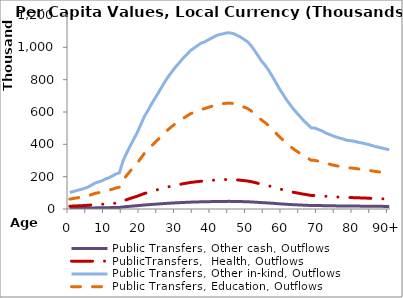
| Category | Public Transfers, Other cash, Outflows | PublicTransfers,  Health, Outflows | Public Transfers, Other in-kind, Outflows | Public Transfers, Education, Outflows |
|---|---|---|---|---|
| 0 | 4410.069 | 17063.185 | 101889.448 | 61240.332 |
|  | 4679.16 | 18104.336 | 108106.475 | 64977.057 |
| 2 | 4948.251 | 19145.487 | 114323.502 | 68713.782 |
| 3 | 5217.342 | 20186.637 | 120540.529 | 72450.506 |
| 4 | 5486.433 | 21227.788 | 126757.557 | 76187.231 |
| 5 | 5808.975 | 22475.749 | 134209.511 | 80666.205 |
| 6 | 6321.265 | 24457.872 | 146045.366 | 87780.108 |
| 7 | 6901.315 | 26702.17 | 159446.747 | 95834.966 |
| 8 | 7226.914 | 27961.957 | 166969.318 | 100356.384 |
| 9 | 7522.323 | 29104.936 | 173794.392 | 104458.573 |
| 10 | 8005.09 | 30972.832 | 184948.165 | 111162.513 |
| 11 | 8348.884 | 32303.02 | 192891.123 | 115936.603 |
| 12 | 8843.313 | 34216.034 | 204314.31 | 122802.474 |
| 13 | 9373.34 | 36266.786 | 216559.968 | 130162.688 |
| 14 | 9721.82 | 37615.106 | 224611.195 | 135001.853 |
| 15 | 12869.065 | 49792.241 | 297324.562 | 178705.993 |
| 16 | 14923.259 | 57740.21 | 344784.294 | 207231.516 |
| 17 | 16827.781 | 65109.078 | 388786.035 | 233678.624 |
| 18 | 18647.33 | 72149.172 | 430824.572 | 258945.755 |
| 19 | 20450.364 | 79125.366 | 472481.538 | 283983.544 |
| 20 | 22584.677 | 87383.326 | 521792.321 | 313621.635 |
| 21 | 24752.427 | 95770.661 | 571875.637 | 343724.054 |
| 22 | 26306.238 | 101782.575 | 607774.601 | 365301.014 |
| 23 | 28080.026 | 108645.617 | 648755.902 | 389932.696 |
| 24 | 29637.474 | 114671.601 | 684738.881 | 411560.152 |
| 25 | 31181.022 | 120643.81 | 720400.748 | 432994.605 |
| 26 | 32790.407 | 126870.749 | 757583.688 | 455343.294 |
| 27 | 34377.224 | 133010.371 | 794245.232 | 477378.6 |
| 28 | 35763.812 | 138375.276 | 826280.708 | 496633.422 |
| 29 | 37070.889 | 143432.543 | 856479.18 | 514784.119 |
| 30 | 38240.795 | 147959.075 | 883508.473 | 531029.991 |
| 31 | 39314.605 | 152113.8 | 908317.596 | 545941.436 |
| 32 | 40468.771 | 156579.434 | 934983.249 | 561968.743 |
| 33 | 41412.797 | 160232.004 | 956793.851 | 575077.937 |
| 34 | 42411.259 | 164095.194 | 979862.133 | 588943.055 |
| 35 | 43076.762 | 166670.122 | 995237.804 | 598184.554 |
| 36 | 43767.657 | 169343.291 | 1011200.111 | 607778.648 |
| 37 | 44399.584 | 171788.305 | 1025800.03 | 616553.884 |
| 38 | 44736.104 | 173090.349 | 1033574.925 | 621226.96 |
| 39 | 45279.554 | 175193.035 | 1046130.701 | 628773.569 |
| 40 | 45751.83 | 177020.338 | 1057042.085 | 635331.823 |
| 41 | 46290.172 | 179103.262 | 1069479.855 | 642807.505 |
| 42 | 46677.716 | 180602.722 | 1078433.582 | 648189.115 |
| 43 | 46857.783 | 181299.427 | 1082593.822 | 650689.614 |
| 44 | 47133.876 | 182367.671 | 1088972.629 | 654523.576 |
| 45 | 47173.06 | 182519.281 | 1089877.94 | 655067.71 |
| 46 | 46993.878 | 181826.001 | 1085738.152 | 652579.504 |
| 47 | 46567.967 | 180178.088 | 1075897.966 | 646665.09 |
| 48 | 46090.468 | 178330.578 | 1064865.923 | 640034.316 |
| 49 | 45460.776 | 175894.21 | 1050317.629 | 631290.109 |
| 50 | 44829.472 | 173451.605 | 1035732.096 | 622523.521 |
| 51 | 43851.841 | 169669.013 | 1013145.091 | 608947.672 |
| 52 | 42521.805 | 164522.911 | 982416.156 | 590478.143 |
| 53 | 41101.014 | 159025.672 | 949590.476 | 570748.371 |
| 54 | 39635.663 | 153356.019 | 915735.263 | 550399.801 |
| 55 | 38544.794 | 149135.291 | 890532.015 | 535251.469 |
| 56 | 37151.231 | 143743.396 | 858335.379 | 515899.782 |
| 57 | 35620.198 | 137819.613 | 822962.676 | 494639.129 |
| 58 | 33957.193 | 131385.212 | 784540.916 | 471545.851 |
| 59 | 32297.077 | 124961.984 | 746185.873 | 448492.673 |
| 60 | 30836.196 | 119309.63 | 712433.956 | 428206.19 |
| 61 | 29309.346 | 113402.03 | 677157.886 | 407003.619 |
| 62 | 28032.336 | 108461.096 | 647654.071 | 389270.444 |
| 63 | 26761.273 | 103543.171 | 618287.652 | 371619.85 |
| 64 | 25686.994 | 99386.635 | 593467.715 | 356701.905 |
| 65 | 24624.289 | 95274.878 | 568915.167 | 341944.673 |
| 66 | 23563.854 | 91171.901 | 544415.051 | 327218.955 |
| 67 | 22687.988 | 87783.054 | 524179.218 | 315056.271 |
| 68 | 21722.373 | 84046.952 | 501869.819 | 301647.277 |
| 69 | 21664.12 | 83821.561 | 500523.944 | 300838.343 |
| 70 | 21308.467 | 82445.488 | 492306.995 | 295899.572 |
| 71 | 20950.016 | 81058.594 | 484025.426 | 290921.961 |
| 72 | 20395.429 | 78912.818 | 471212.35 | 283220.702 |
| 73 | 20022.635 | 77470.424 | 462599.376 | 278043.901 |
| 74 | 19628.894 | 75946.983 | 453502.449 | 272576.222 |
| 75 | 19285.526 | 74618.443 | 445569.333 | 267808.047 |
| 76 | 18999.112 | 73510.266 | 438952.074 | 263830.765 |
| 77 | 18754.046 | 72562.072 | 433290.123 | 260427.666 |
| 78 | 18422.142 | 71277.887 | 425621.862 | 255818.682 |
| 79 | 18301.943 | 70812.819 | 422844.802 | 254149.539 |
| 80 | 18155.428 | 70245.933 | 419459.756 | 252114.968 |
| 81 | 17919.183 | 69331.868 | 414001.597 | 248834.358 |
| 82 | 17735.602 | 68621.566 | 409760.163 | 246285.058 |
| 83 | 17530.327 | 67827.328 | 405017.527 | 243434.512 |
| 84 | 17314.394 | 66991.853 | 400028.656 | 240435.967 |
| 85 | 17018.57 | 65847.269 | 393194 | 236328.018 |
| 86 | 16758.539 | 64841.171 | 387186.279 | 232717.096 |
| 87 | 16533.404 | 63970.093 | 381984.814 | 229590.772 |
| 88 | 16308.27 | 63099.016 | 376783.348 | 226464.447 |
| 89 | 16083.136 | 62227.939 | 371581.883 | 223338.123 |
| 90+ | 15858.001 | 61356.862 | 366380.418 | 220211.799 |